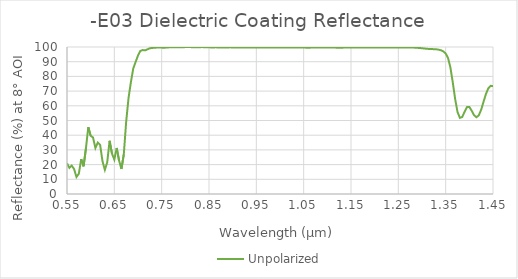
| Category | Unpolarized |
|---|---|
| 0.55 | 20.899 |
| 0.555 | 17.801 |
| 0.56 | 19.289 |
| 0.565 | 16.941 |
| 0.57 | 11.557 |
| 0.575 | 13.817 |
| 0.58 | 23.723 |
| 0.585 | 18.859 |
| 0.59 | 31.103 |
| 0.595 | 45.435 |
| 0.6 | 39.583 |
| 0.605 | 38.446 |
| 0.61 | 31.267 |
| 0.615 | 34.959 |
| 0.62 | 33.407 |
| 0.625 | 22.259 |
| 0.63 | 16.421 |
| 0.635 | 21.625 |
| 0.64 | 36.184 |
| 0.645 | 27.505 |
| 0.65 | 23.407 |
| 0.655 | 31.305 |
| 0.66 | 22.717 |
| 0.665 | 17.025 |
| 0.67 | 26.965 |
| 0.675 | 49.135 |
| 0.68 | 65.304 |
| 0.685 | 76.15 |
| 0.69 | 85.396 |
| 0.695 | 89.857 |
| 0.7 | 94.182 |
| 0.705 | 97.362 |
| 0.71 | 97.924 |
| 0.715 | 97.706 |
| 0.72 | 98.404 |
| 0.725 | 99.135 |
| 0.73 | 99.371 |
| 0.735 | 99.494 |
| 0.74 | 99.608 |
| 0.745 | 99.635 |
| 0.75 | 99.581 |
| 0.755 | 99.51 |
| 0.76 | 99.611 |
| 0.765 | 99.753 |
| 0.77 | 99.764 |
| 0.775 | 99.862 |
| 0.78 | 99.843 |
| 0.785 | 99.802 |
| 0.79 | 99.773 |
| 0.795 | 99.83 |
| 0.8 | 99.946 |
| 0.805 | 99.996 |
| 0.81 | 99.957 |
| 0.815 | 99.853 |
| 0.82 | 99.839 |
| 0.825 | 99.875 |
| 0.83 | 99.901 |
| 0.835 | 99.92 |
| 0.84 | 99.905 |
| 0.845 | 99.775 |
| 0.85 | 99.78 |
| 0.855 | 99.712 |
| 0.86 | 99.72 |
| 0.865 | 99.77 |
| 0.87 | 99.617 |
| 0.875 | 99.653 |
| 0.88 | 99.722 |
| 0.885 | 99.718 |
| 0.89 | 99.713 |
| 0.895 | 99.761 |
| 0.9 | 99.658 |
| 0.905 | 99.649 |
| 0.91 | 99.726 |
| 0.915 | 99.739 |
| 0.92 | 99.713 |
| 0.925 | 99.71 |
| 0.93 | 99.731 |
| 0.935 | 99.67 |
| 0.94 | 99.666 |
| 0.945 | 99.645 |
| 0.95 | 99.653 |
| 0.955 | 99.625 |
| 0.96 | 99.586 |
| 0.965 | 99.578 |
| 0.97 | 99.592 |
| 0.975 | 99.617 |
| 0.98 | 99.646 |
| 0.985 | 99.641 |
| 0.99 | 99.663 |
| 0.995 | 99.67 |
| 1.0 | 99.66 |
| 1.005 | 99.666 |
| 1.01 | 99.669 |
| 1.015 | 99.669 |
| 1.02 | 99.654 |
| 1.025 | 99.641 |
| 1.03 | 99.645 |
| 1.035 | 99.643 |
| 1.04 | 99.634 |
| 1.045 | 99.622 |
| 1.05 | 99.6 |
| 1.055 | 99.569 |
| 1.06 | 99.556 |
| 1.065 | 99.576 |
| 1.07 | 99.582 |
| 1.075 | 99.576 |
| 1.08 | 99.611 |
| 1.085 | 99.607 |
| 1.09 | 99.614 |
| 1.095 | 99.637 |
| 1.1 | 99.625 |
| 1.105 | 99.624 |
| 1.11 | 99.619 |
| 1.115 | 99.583 |
| 1.12 | 99.565 |
| 1.125 | 99.539 |
| 1.13 | 99.526 |
| 1.135 | 99.59 |
| 1.14 | 99.636 |
| 1.145 | 99.645 |
| 1.15 | 99.646 |
| 1.155 | 99.657 |
| 1.16 | 99.672 |
| 1.165 | 99.641 |
| 1.17 | 99.619 |
| 1.175 | 99.594 |
| 1.18 | 99.611 |
| 1.185 | 99.63 |
| 1.19 | 99.625 |
| 1.195 | 99.64 |
| 1.2 | 99.653 |
| 1.205 | 99.661 |
| 1.21 | 99.654 |
| 1.215 | 99.646 |
| 1.22 | 99.636 |
| 1.225 | 99.606 |
| 1.23 | 99.579 |
| 1.235 | 99.598 |
| 1.24 | 99.628 |
| 1.245 | 99.641 |
| 1.25 | 99.664 |
| 1.255 | 99.697 |
| 1.26 | 99.668 |
| 1.265 | 99.652 |
| 1.27 | 99.654 |
| 1.275 | 99.665 |
| 1.28 | 99.635 |
| 1.285 | 99.549 |
| 1.29 | 99.457 |
| 1.295 | 99.314 |
| 1.3 | 99.156 |
| 1.305 | 98.962 |
| 1.31 | 98.806 |
| 1.315 | 98.656 |
| 1.32 | 98.564 |
| 1.325 | 98.549 |
| 1.33 | 98.437 |
| 1.335 | 98.208 |
| 1.34 | 97.781 |
| 1.345 | 96.995 |
| 1.35 | 95.615 |
| 1.355 | 92.451 |
| 1.36 | 86.076 |
| 1.365 | 75.912 |
| 1.37 | 64.674 |
| 1.375 | 55.829 |
| 1.38 | 51.778 |
| 1.385 | 52.401 |
| 1.39 | 55.932 |
| 1.395 | 59.115 |
| 1.4 | 59.23 |
| 1.405 | 56.623 |
| 1.41 | 53.59 |
| 1.415 | 52.226 |
| 1.42 | 53.516 |
| 1.425 | 57.32 |
| 1.43 | 62.734 |
| 1.435 | 67.946 |
| 1.44 | 71.834 |
| 1.445 | 73.602 |
| 1.45 | 73.34 |